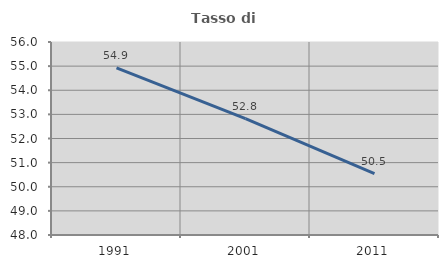
| Category | Tasso di occupazione   |
|---|---|
| 1991.0 | 54.929 |
| 2001.0 | 52.82 |
| 2011.0 | 50.542 |